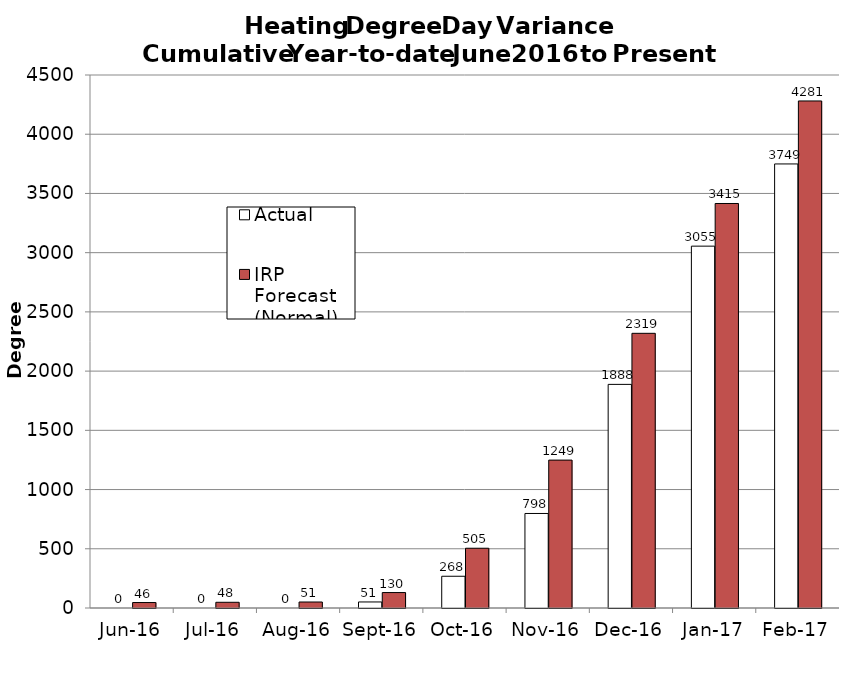
| Category | Actual | IRP Forecast (Normal) |
|---|---|---|
| 2016-06-01 | 0 | 46.17 |
| 2016-07-01 | 0 | 48.25 |
| 2016-08-01 | 0 | 50.55 |
| 2016-09-01 | 51 | 130.38 |
| 2016-10-01 | 268 | 504.5 |
| 2016-11-01 | 798 | 1248.68 |
| 2016-12-01 | 1888 | 2319 |
| 2017-01-01 | 3055 | 3415.15 |
| 2017-02-01 | 3749 | 4280.78 |